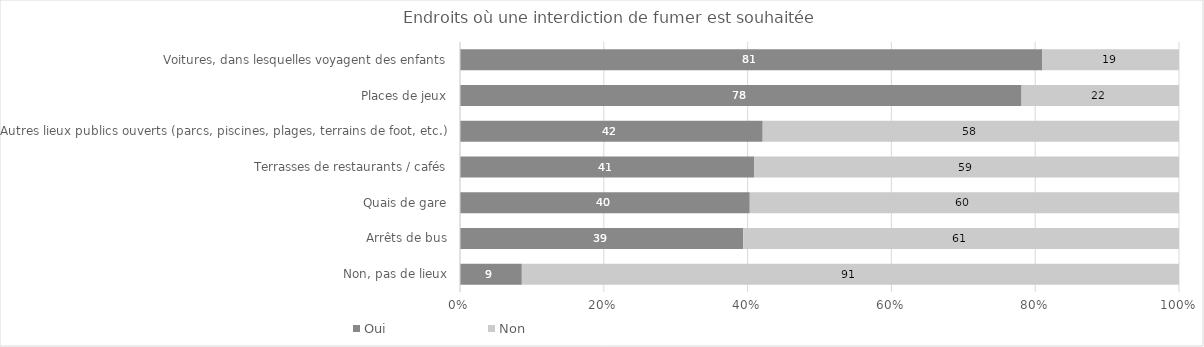
| Category | Oui | Non |
|---|---|---|
| Voitures, dans lesquelles voyagent des enfants | 81 | 19 |
| Places de jeux | 78.1 | 21.9 |
| Autres lieux publics ouverts (parcs, piscines, plages, terrains de foot, etc.) | 42.1 | 57.9 |
| Terrasses de restaurants / cafés | 40.9 | 59.1 |
| Quais de gare | 40.3 | 59.7 |
| Arrêts de bus | 39.4 | 60.6 |
| Non, pas de lieux | 8.6 | 91.4 |